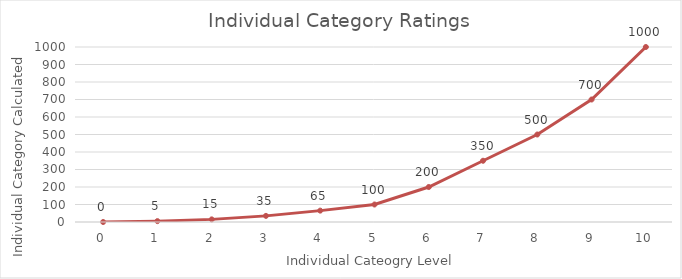
| Category | Calculated |
|---|---|
| 0.0 | 0 |
| 1.0 | 5 |
| 2.0 | 15 |
| 3.0 | 35 |
| 4.0 | 65 |
| 5.0 | 100 |
| 6.0 | 200 |
| 7.0 | 350 |
| 8.0 | 500 |
| 9.0 | 700 |
| 10.0 | 1000 |